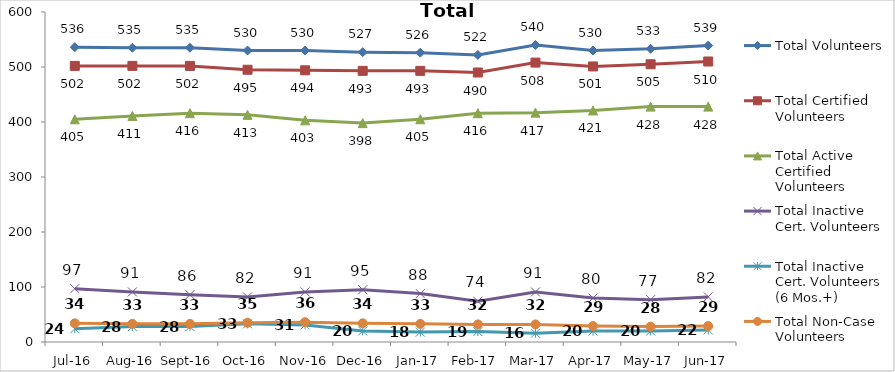
| Category | Total Volunteers | Total Certified Volunteers | Total Active Certified Volunteers | Total Inactive Cert. Volunteers | Total Inactive Cert. Volunteers (6 Mos.+) | Total Non-Case Volunteers |
|---|---|---|---|---|---|---|
| Jul-16 | 536 | 502 | 405 | 97 | 24 | 34 |
| Aug-16 | 535 | 502 | 411 | 91 | 28 | 33 |
| Sep-16 | 535 | 502 | 416 | 86 | 28 | 33 |
| Oct-16 | 530 | 495 | 413 | 82 | 33 | 35 |
| Nov-16 | 530 | 494 | 403 | 91 | 31 | 36 |
| Dec-16 | 527 | 493 | 398 | 95 | 20 | 34 |
| Jan-17 | 526 | 493 | 405 | 88 | 18 | 33 |
| Feb-17 | 522 | 490 | 416 | 74 | 19 | 32 |
| Mar-17 | 540 | 508 | 417 | 91 | 16 | 32 |
| Apr-17 | 530 | 501 | 421 | 80 | 20 | 29 |
| May-17 | 533 | 505 | 428 | 77 | 20 | 28 |
| Jun-17 | 539 | 510 | 428 | 82 | 22 | 29 |